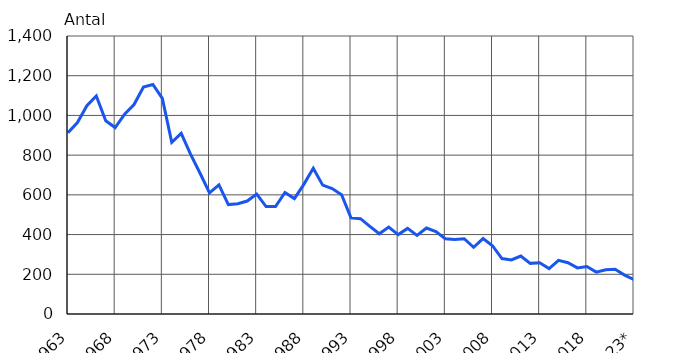
| Category | Döda i vägtrafikolyckor |
|---|---|
| 1963 | 913 |
| 1964 | 964 |
| 1965 | 1049 |
| 1966 | 1098 |
| 1967 | 973 |
| 1968 | 939 |
| 1969 | 1006 |
| 1970 | 1055 |
| 1971 | 1143 |
| 1972 | 1156 |
| 1973 | 1086 |
| 1974 | 865 |
| 1975 | 910 |
| 1976 | 804 |
| 1977 | 709 |
| 1978 | 610 |
| 1979 | 650 |
| 1980 | 551 |
| 1981 | 555 |
| 1982 | 569 |
| 1983 | 604 |
| 1984 | 541 |
| 1985 | 541 |
| 1986 | 612 |
| 1987 | 581 |
| 1988 | 653 |
| 1989 | 734 |
| 1990 | 649 |
| 1991 | 632 |
| 1992 | 601 |
| 1993 | 484 |
| 1994 | 480 |
| 1995 | 441 |
| 1996 | 404 |
| 1997 | 438 |
| 1998 | 400 |
| 1999 | 431 |
| 2000 | 396 |
| 2001 | 433 |
| 2002 | 415 |
| 2003 | 379 |
| 2004 | 375 |
| 2005 | 379 |
| 2006 | 336 |
| 2007 | 380 |
| 2008 | 344 |
| 2009 | 279 |
| 2010 | 272 |
| 2011 | 292 |
| 2012 | 255 |
| 2013 | 258 |
| 2014 | 229 |
| 2015 | 270 |
| 2016 | 258 |
| 2017 | 232 |
| 2018 | 239 |
| 2019 | 211 |
| 2020 | 223 |
| 2021 | 225 |
| 2022 | 196 |
| 2023* | 173 |